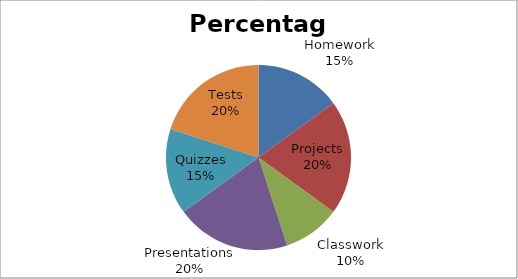
| Category | Percentage |
|---|---|
| Homework | 15 |
| Projects | 20 |
| Classwork | 10 |
| Presentations | 20 |
| Quizzes | 15 |
| Tests | 20 |